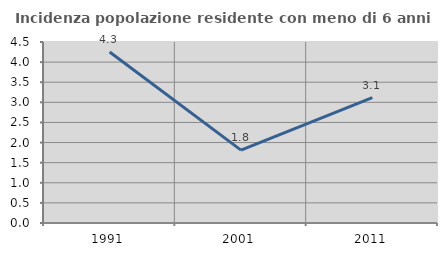
| Category | Incidenza popolazione residente con meno di 6 anni |
|---|---|
| 1991.0 | 4.252 |
| 2001.0 | 1.811 |
| 2011.0 | 3.118 |